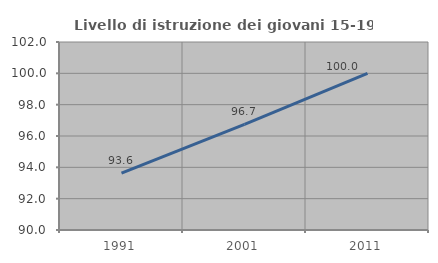
| Category | Livello di istruzione dei giovani 15-19 anni |
|---|---|
| 1991.0 | 93.631 |
| 2001.0 | 96.739 |
| 2011.0 | 100 |